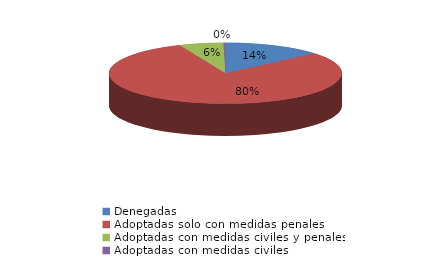
| Category | Series 0 |
|---|---|
| Denegadas | 47 |
| Adoptadas solo con medidas penales | 276 |
| Adoptadas con medidas civiles y penales | 21 |
| Adoptadas con medidas civiles | 1 |